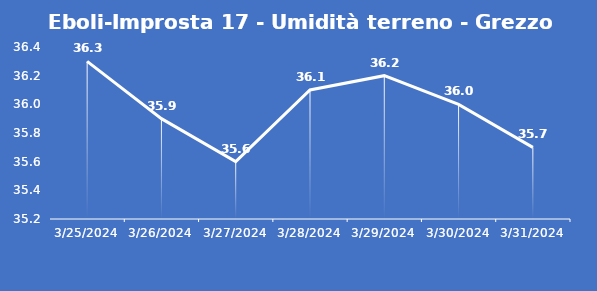
| Category | Eboli-Improsta 17 - Umidità terreno - Grezzo (%VWC) |
|---|---|
| 3/25/24 | 36.3 |
| 3/26/24 | 35.9 |
| 3/27/24 | 35.6 |
| 3/28/24 | 36.1 |
| 3/29/24 | 36.2 |
| 3/30/24 | 36 |
| 3/31/24 | 35.7 |